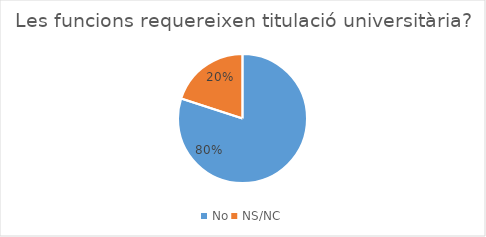
| Category | Series 0 |
|---|---|
| No | 4 |
| NS/NC | 1 |